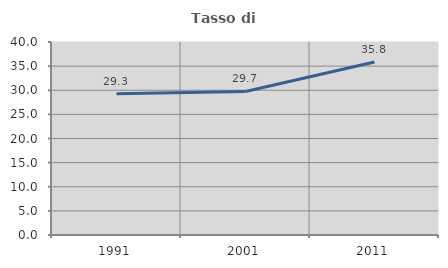
| Category | Tasso di occupazione   |
|---|---|
| 1991.0 | 29.282 |
| 2001.0 | 29.742 |
| 2011.0 | 35.843 |